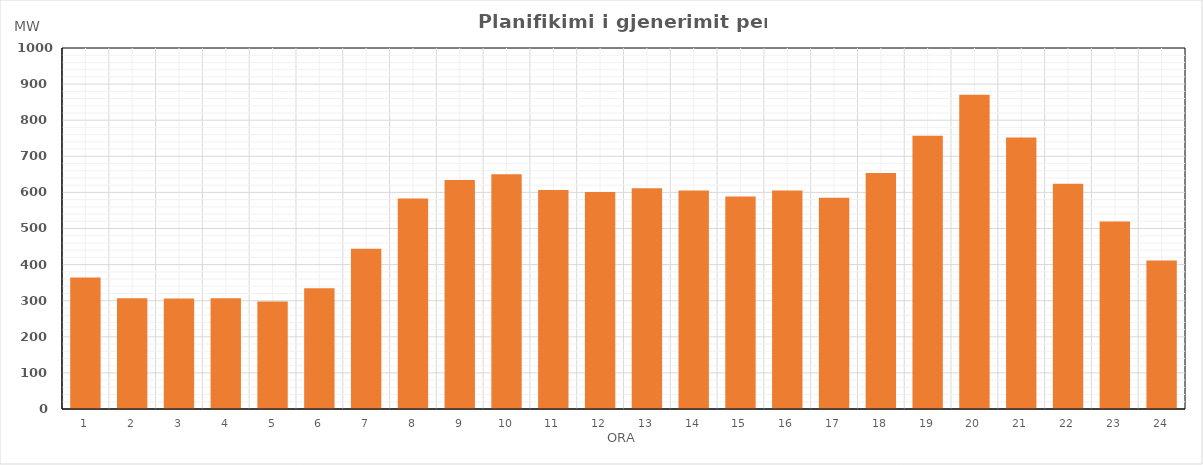
| Category | Max (MW) |
|---|---|
| 0 | 364.411 |
| 1 | 306.7 |
| 2 | 305.885 |
| 3 | 307.125 |
| 4 | 297.553 |
| 5 | 334.65 |
| 6 | 443.76 |
| 7 | 583.338 |
| 8 | 634.075 |
| 9 | 649.932 |
| 10 | 606.341 |
| 11 | 601.175 |
| 12 | 611.4 |
| 13 | 605.264 |
| 14 | 588.608 |
| 15 | 604.917 |
| 16 | 585.237 |
| 17 | 653.521 |
| 18 | 757.092 |
| 19 | 870.566 |
| 20 | 752.347 |
| 21 | 623.869 |
| 22 | 519.388 |
| 23 | 411.051 |